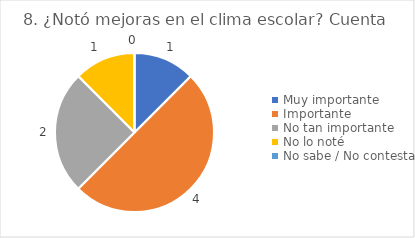
| Category | 8. ¿Notó mejoras en el clima escolar? |
|---|---|
| Muy importante  | 0.125 |
| Importante  | 0.5 |
| No tan importante  | 0.25 |
| No lo noté  | 0.125 |
| No sabe / No contesta | 0 |